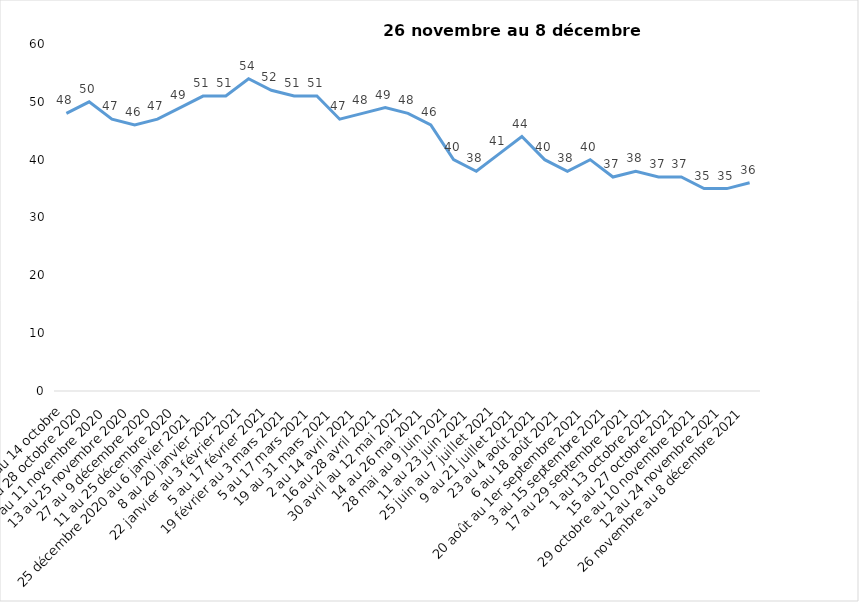
| Category | Toujours aux trois mesures |
|---|---|
| 2 au 14 octobre | 48 |
| 16 au 28 octobre 2020 | 50 |
| 30 octobre au 11 novembre 2020 | 47 |
| 13 au 25 novembre 2020 | 46 |
| 27 au 9 décembre 2020 | 47 |
| 11 au 25 décembre 2020 | 49 |
| 25 décembre 2020 au 6 janvier 2021 | 51 |
| 8 au 20 janvier 2021 | 51 |
| 22 janvier au 3 février 2021 | 54 |
| 5 au 17 février 2021 | 52 |
| 19 février au 3 mars 2021 | 51 |
| 5 au 17 mars 2021 | 51 |
| 19 au 31 mars 2021 | 47 |
| 2 au 14 avril 2021 | 48 |
| 16 au 28 avril 2021 | 49 |
| 30 avril au 12 mai 2021 | 48 |
| 14 au 26 mai 2021 | 46 |
| 28 mai au 9 juin 2021 | 40 |
| 11 au 23 juin 2021 | 38 |
| 25 juin au 7 juillet 2021 | 41 |
| 9 au 21 juillet 2021 | 44 |
| 23 au 4 août 2021 | 40 |
| 6 au 18 août 2021 | 38 |
| 20 août au 1er septembre 2021 | 40 |
| 3 au 15 septembre 2021 | 37 |
| 17 au 29 septembre 2021 | 38 |
| 1 au 13 octobre 2021 | 37 |
| 15 au 27 octobre 2021 | 37 |
| 29 octobre au 10 novembre 2021 | 35 |
| 12 au 24 novembre 2021 | 35 |
| 26 novembre au 8 décembre 2021 | 36 |